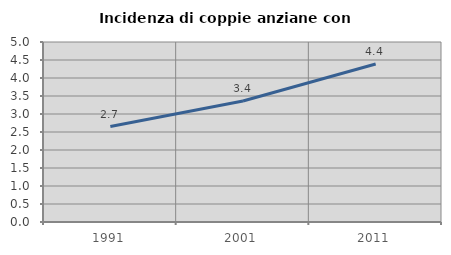
| Category | Incidenza di coppie anziane con figli |
|---|---|
| 1991.0 | 2.651 |
| 2001.0 | 3.36 |
| 2011.0 | 4.389 |